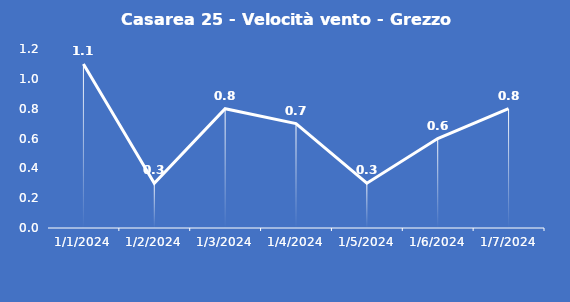
| Category | Casarea 25 - Velocità vento - Grezzo (m/s) |
|---|---|
| 1/1/24 | 1.1 |
| 1/2/24 | 0.3 |
| 1/3/24 | 0.8 |
| 1/4/24 | 0.7 |
| 1/5/24 | 0.3 |
| 1/6/24 | 0.6 |
| 1/7/24 | 0.8 |